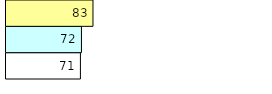
| Category | Total Standouts | Total Recd | Total Tipsters |
|---|---|---|---|
| 0 | 71 | 72 | 83 |